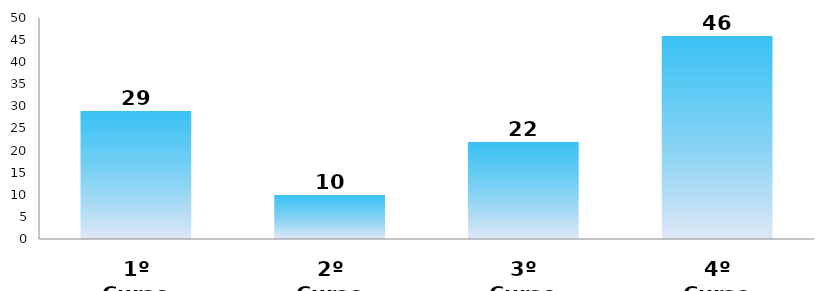
| Category | Series 0 |
|---|---|
| 1º Curso | 29 |
| 2º Curso | 10 |
| 3º Curso | 22 |
| 4º Curso | 46 |